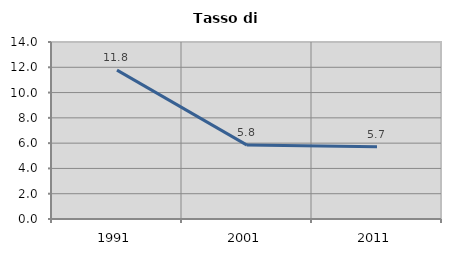
| Category | Tasso di disoccupazione   |
|---|---|
| 1991.0 | 11.772 |
| 2001.0 | 5.844 |
| 2011.0 | 5.714 |